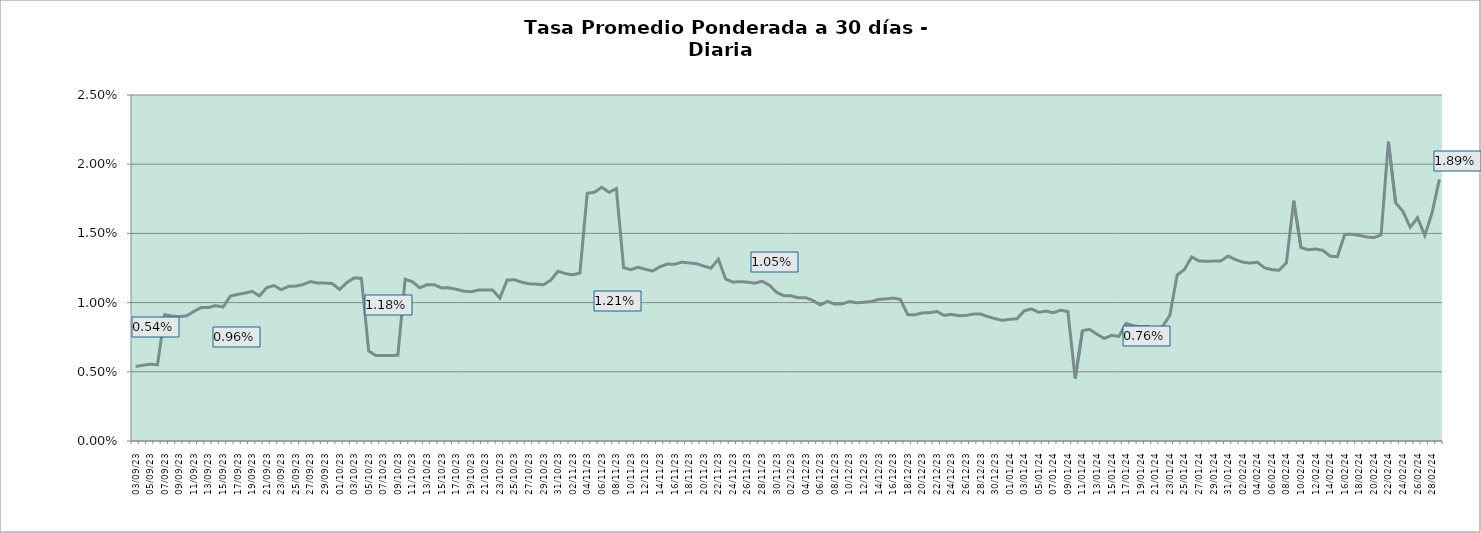
| Category | Tasa a 30 días |
|---|---|
| 2023-09-03 | 0.005 |
| 2023-09-04 | 0.005 |
| 2023-09-05 | 0.006 |
| 2023-09-06 | 0.006 |
| 2023-09-07 | 0.009 |
| 2023-09-08 | 0.009 |
| 2023-09-09 | 0.009 |
| 2023-09-10 | 0.009 |
| 2023-09-11 | 0.009 |
| 2023-09-12 | 0.01 |
| 2023-09-13 | 0.01 |
| 2023-09-14 | 0.01 |
| 2023-09-15 | 0.01 |
| 2023-09-16 | 0.01 |
| 2023-09-17 | 0.011 |
| 2023-09-18 | 0.011 |
| 2023-09-19 | 0.011 |
| 2023-09-20 | 0.01 |
| 2023-09-21 | 0.011 |
| 2023-09-22 | 0.011 |
| 2023-09-23 | 0.011 |
| 2023-09-24 | 0.011 |
| 2023-09-25 | 0.011 |
| 2023-09-26 | 0.011 |
| 2023-09-27 | 0.012 |
| 2023-09-28 | 0.011 |
| 2023-09-29 | 0.011 |
| 2023-09-30 | 0.011 |
| 2023-10-01 | 0.011 |
| 2023-10-02 | 0.011 |
| 2023-10-03 | 0.012 |
| 2023-10-04 | 0.012 |
| 2023-10-05 | 0.006 |
| 2023-10-06 | 0.006 |
| 2023-10-07 | 0.006 |
| 2023-10-08 | 0.006 |
| 2023-10-09 | 0.006 |
| 2023-10-10 | 0.012 |
| 2023-10-11 | 0.012 |
| 2023-10-12 | 0.011 |
| 2023-10-13 | 0.011 |
| 2023-10-14 | 0.011 |
| 2023-10-15 | 0.011 |
| 2023-10-16 | 0.011 |
| 2023-10-17 | 0.011 |
| 2023-10-18 | 0.011 |
| 2023-10-19 | 0.011 |
| 2023-10-20 | 0.011 |
| 2023-10-21 | 0.011 |
| 2023-10-22 | 0.011 |
| 2023-10-23 | 0.01 |
| 2023-10-24 | 0.012 |
| 2023-10-25 | 0.012 |
| 2023-10-26 | 0.011 |
| 2023-10-27 | 0.011 |
| 2023-10-28 | 0.011 |
| 2023-10-29 | 0.011 |
| 2023-10-30 | 0.012 |
| 2023-10-31 | 0.012 |
| 2023-11-01 | 0.012 |
| 2023-11-02 | 0.012 |
| 2023-11-03 | 0.012 |
| 2023-11-04 | 0.018 |
| 2023-11-05 | 0.018 |
| 2023-11-06 | 0.018 |
| 2023-11-07 | 0.018 |
| 2023-11-08 | 0.018 |
| 2023-11-09 | 0.013 |
| 2023-11-10 | 0.012 |
| 2023-11-11 | 0.013 |
| 2023-11-12 | 0.012 |
| 2023-11-13 | 0.012 |
| 2023-11-14 | 0.013 |
| 2023-11-15 | 0.013 |
| 2023-11-16 | 0.013 |
| 2023-11-17 | 0.013 |
| 2023-11-18 | 0.013 |
| 2023-11-19 | 0.013 |
| 2023-11-20 | 0.013 |
| 2023-11-21 | 0.012 |
| 2023-11-22 | 0.013 |
| 2023-11-23 | 0.012 |
| 2023-11-24 | 0.011 |
| 2023-11-25 | 0.012 |
| 2023-11-26 | 0.011 |
| 2023-11-27 | 0.011 |
| 2023-11-28 | 0.012 |
| 2023-11-29 | 0.011 |
| 2023-11-30 | 0.011 |
| 2023-12-01 | 0.01 |
| 2023-12-02 | 0.01 |
| 2023-12-03 | 0.01 |
| 2023-12-04 | 0.01 |
| 2023-12-05 | 0.01 |
| 2023-12-06 | 0.01 |
| 2023-12-07 | 0.01 |
| 2023-12-08 | 0.01 |
| 2023-12-09 | 0.01 |
| 2023-12-10 | 0.01 |
| 2023-12-11 | 0.01 |
| 2023-12-12 | 0.01 |
| 2023-12-13 | 0.01 |
| 2023-12-14 | 0.01 |
| 2023-12-15 | 0.01 |
| 2023-12-16 | 0.01 |
| 2023-12-17 | 0.01 |
| 2023-12-18 | 0.009 |
| 2023-12-19 | 0.009 |
| 2023-12-20 | 0.009 |
| 2023-12-21 | 0.009 |
| 2023-12-22 | 0.009 |
| 2023-12-23 | 0.009 |
| 2023-12-24 | 0.009 |
| 2023-12-25 | 0.009 |
| 2023-12-26 | 0.009 |
| 2023-12-27 | 0.009 |
| 2023-12-28 | 0.009 |
| 2023-12-29 | 0.009 |
| 2023-12-30 | 0.009 |
| 2023-12-31 | 0.009 |
| 2024-01-01 | 0.009 |
| 2024-01-02 | 0.009 |
| 2024-01-03 | 0.009 |
| 2024-01-04 | 0.01 |
| 2024-01-05 | 0.009 |
| 2024-01-06 | 0.009 |
| 2024-01-07 | 0.009 |
| 2024-01-08 | 0.009 |
| 2024-01-09 | 0.009 |
| 2024-01-10 | 0.005 |
| 2024-01-11 | 0.008 |
| 2024-01-12 | 0.008 |
| 2024-01-13 | 0.008 |
| 2024-01-14 | 0.007 |
| 2024-01-15 | 0.008 |
| 2024-01-16 | 0.008 |
| 2024-01-17 | 0.008 |
| 2024-01-18 | 0.008 |
| 2024-01-19 | 0.008 |
| 2024-01-20 | 0.008 |
| 2024-01-21 | 0.008 |
| 2024-01-22 | 0.008 |
| 2024-01-23 | 0.009 |
| 2024-01-24 | 0.012 |
| 2024-01-25 | 0.012 |
| 2024-01-26 | 0.013 |
| 2024-01-27 | 0.013 |
| 2024-01-28 | 0.013 |
| 2024-01-29 | 0.013 |
| 2024-01-30 | 0.013 |
| 2024-01-31 | 0.013 |
| 2024-02-01 | 0.013 |
| 2024-02-02 | 0.013 |
| 2024-02-03 | 0.013 |
| 2024-02-04 | 0.013 |
| 2024-02-05 | 0.013 |
| 2024-02-06 | 0.012 |
| 2024-02-07 | 0.012 |
| 2024-02-08 | 0.013 |
| 2024-02-09 | 0.017 |
| 2024-02-10 | 0.014 |
| 2024-02-11 | 0.014 |
| 2024-02-12 | 0.014 |
| 2024-02-13 | 0.014 |
| 2024-02-14 | 0.013 |
| 2024-02-15 | 0.013 |
| 2024-02-16 | 0.015 |
| 2024-02-17 | 0.015 |
| 2024-02-18 | 0.015 |
| 2024-02-19 | 0.015 |
| 2024-02-20 | 0.015 |
| 2024-02-21 | 0.015 |
| 2024-02-22 | 0.022 |
| 2024-02-23 | 0.017 |
| 2024-02-24 | 0.017 |
| 2024-02-25 | 0.015 |
| 2024-02-26 | 0.016 |
| 2024-02-27 | 0.015 |
| 2024-02-28 | 0.016 |
| 2024-02-29 | 0.019 |